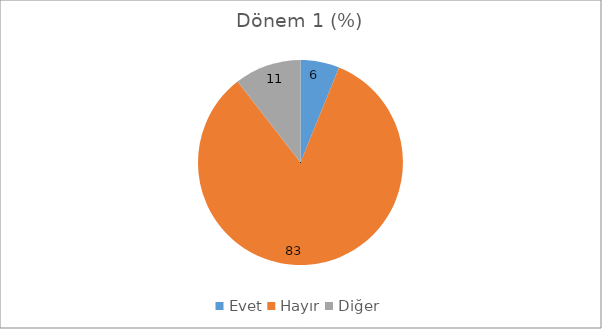
| Category | Dönem 1 (%) |
|---|---|
| Evet | 6.14 |
| Hayır | 83.333 |
| Diğer | 10.526 |